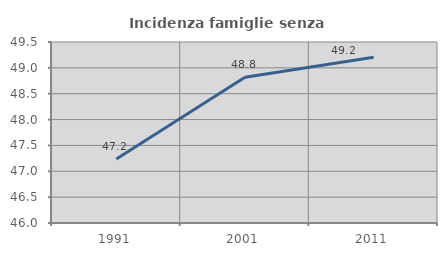
| Category | Incidenza famiglie senza nuclei |
|---|---|
| 1991.0 | 47.239 |
| 2001.0 | 48.819 |
| 2011.0 | 49.206 |